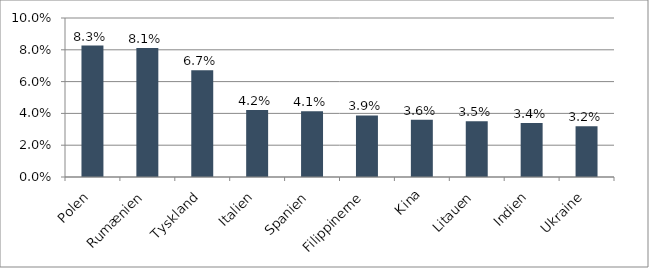
| Category | Series 0 |
|---|---|
| Polen | 0.083 |
| Rumænien | 0.081 |
| Tyskland | 0.067 |
| Italien | 0.042 |
| Spanien | 0.041 |
| Filippinerne | 0.039 |
| Kina | 0.036 |
| Litauen | 0.035 |
| Indien | 0.034 |
| Ukraine | 0.032 |